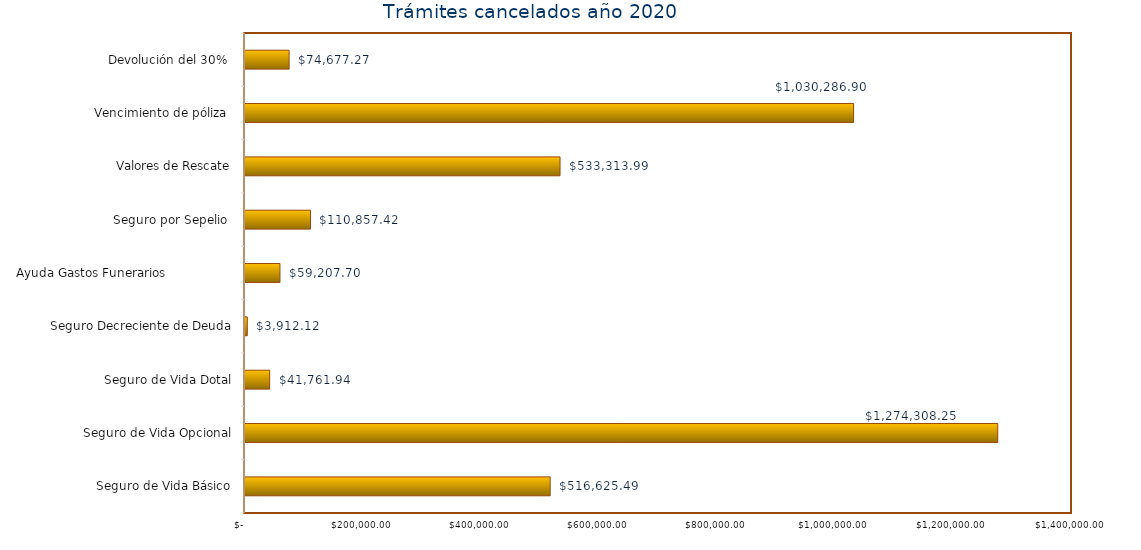
| Category | Monto  |
|---|---|
| Seguro de Vida Básico | 516625.49 |
| Seguro de Vida Opcional | 1274308.25 |
| Seguro de Vida Dotal | 41761.94 |
| Seguro Decreciente de Deuda | 3912.12 |
| Ayuda Gastos Funerarios                  | 59207.7 |
| Seguro por Sepelio  | 110857.42 |
| Valores de Rescate | 533313.99 |
| Vencimiento de póliza  | 1030286.9 |
| Devolución del 30%  | 74677.27 |